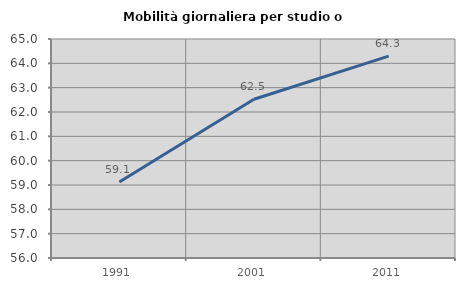
| Category | Mobilità giornaliera per studio o lavoro |
|---|---|
| 1991.0 | 59.126 |
| 2001.0 | 62.524 |
| 2011.0 | 64.296 |